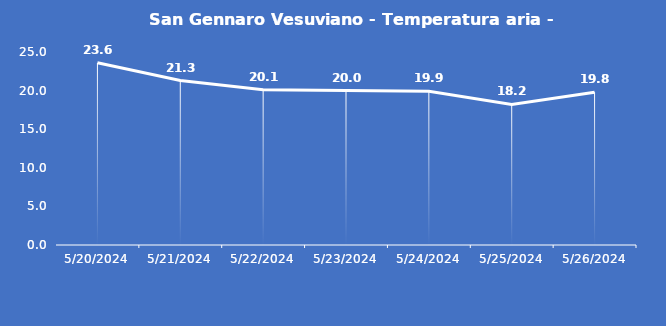
| Category | San Gennaro Vesuviano - Temperatura aria - Grezzo (°C) |
|---|---|
| 5/20/24 | 23.6 |
| 5/21/24 | 21.3 |
| 5/22/24 | 20.1 |
| 5/23/24 | 20 |
| 5/24/24 | 19.9 |
| 5/25/24 | 18.2 |
| 5/26/24 | 19.8 |